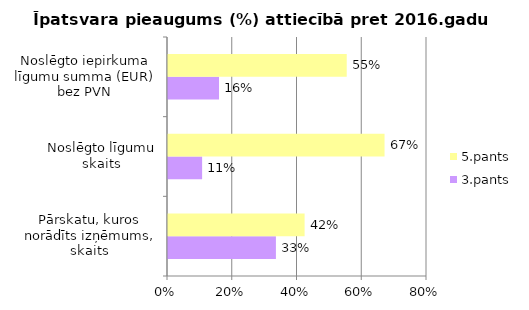
| Category | 3.pants | 5.pants |
|---|---|---|
| Pārskatu, kuros norādīts izņēmums, skaits | 0.333 | 0.422 |
| Noslēgto līgumu skaits | 0.105 | 0.669 |
| Noslēgto iepirkuma līgumu summa (EUR) bez PVN | 0.158 | 0.552 |